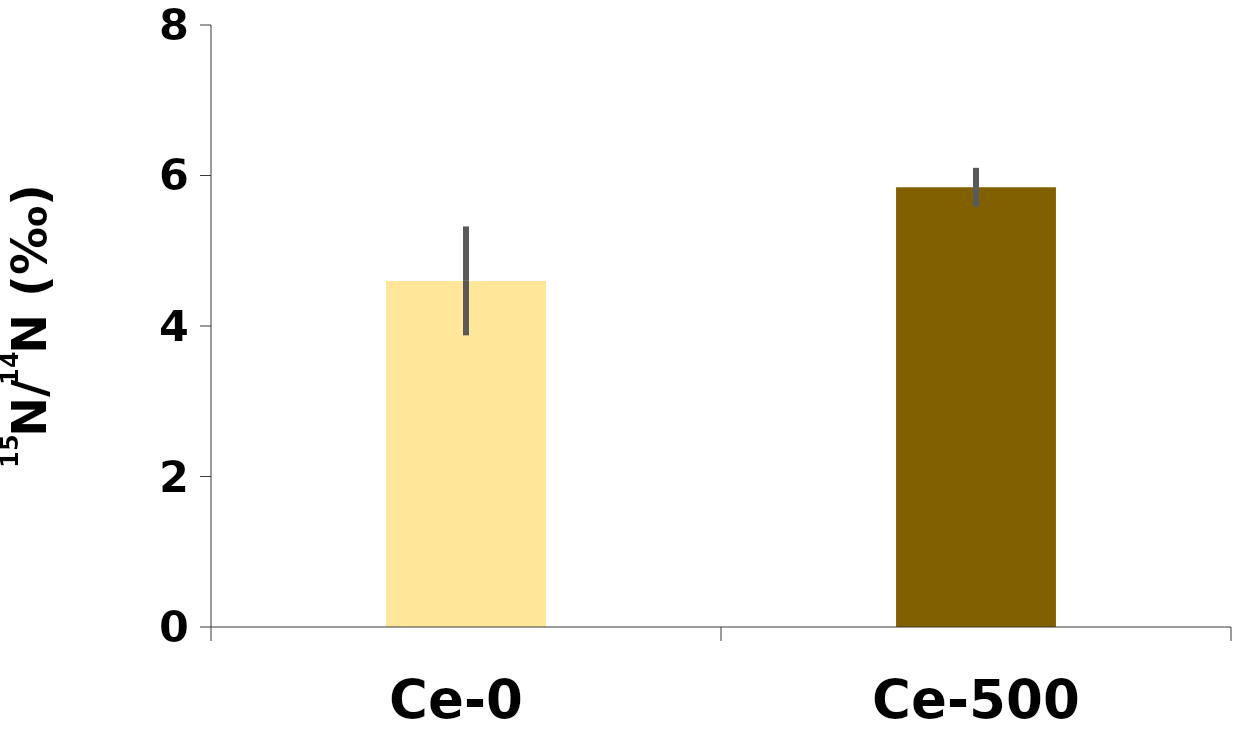
| Category | δ15N |
|---|---|
| Ce-0 | 4.6 |
| Ce-500 | 5.842 |